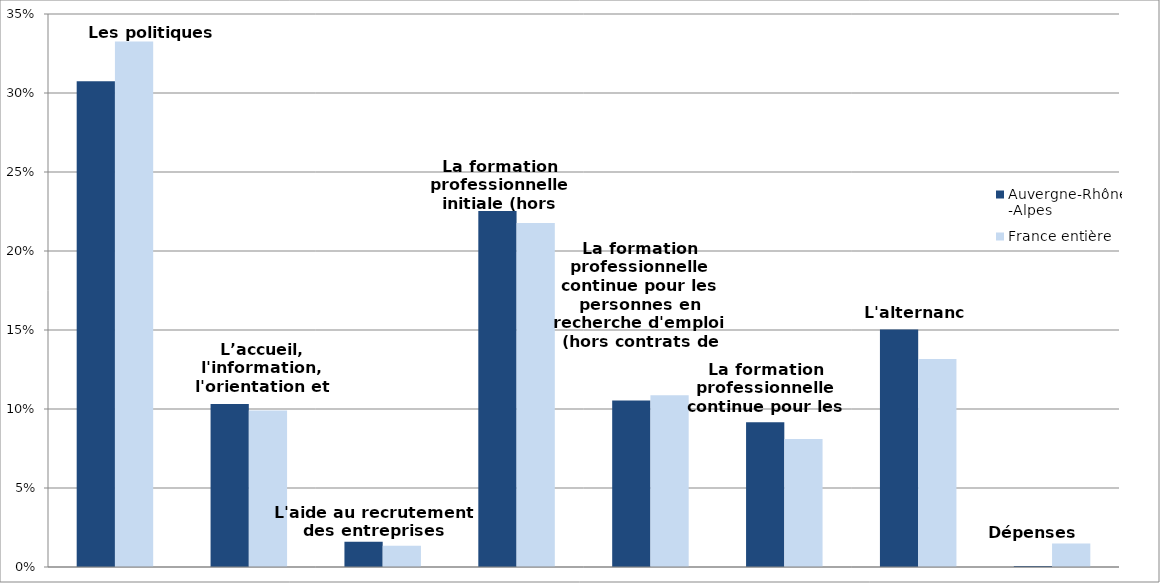
| Category | Auvergne-Rhône-Alpes | France entière |
|---|---|---|
| Les politiques d'emploi | 0.307 | 0.333 |
| L’accueil, l'information, l'orientation et l'accompagnement | 0.103 | 0.099 |
| L'aide au recrutement des entreprises | 0.016 | 0.013 |
| La formation professionnelle initiale (hors apprentissage) | 0.225 | 0.218 |
| La formation professionnelle continue pour les personnes en recherche d'emploi (hors contrats de professionnalisation) | 0.105 | 0.109 |
| La formation professionnelle continue pour les actifs occupés | 0.092 | 0.081 |
| L'alternance | 0.15 | 0.132 |
| Dépenses non-ventilables | 0.001 | 0.015 |